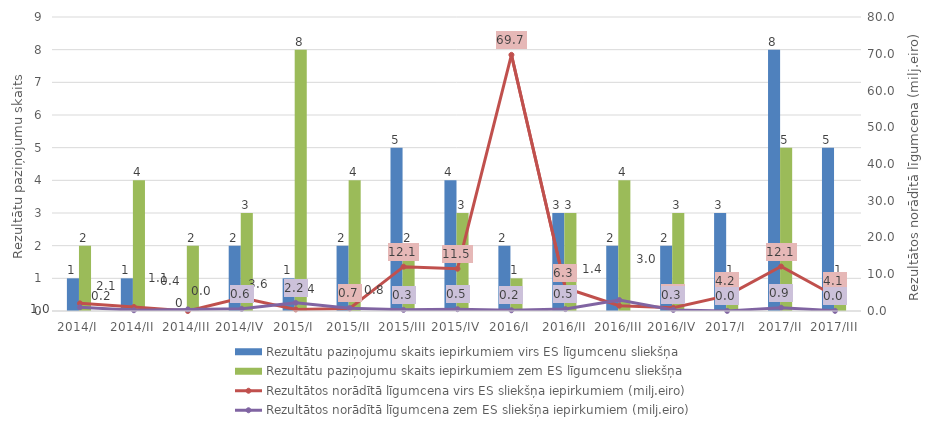
| Category | Rezultātu paziņojumu skaits iepirkumiem virs ES līgumcenu sliekšņa | Rezultātu paziņojumu skaits iepirkumiem zem ES līgumcenu sliekšņa |
|---|---|---|
| 2014/I | 1 | 2 |
| 2014/II | 1 | 4 |
| 2014/III | 0 | 2 |
| 2014/IV | 2 | 3 |
| 2015/I | 1 | 8 |
| 2015/II | 2 | 4 |
| 2015/III | 5 | 2 |
| 2015/IV | 4 | 3 |
| 2016/I | 2 | 1 |
| 2016/II | 3 | 3 |
| 2016/III | 2 | 4 |
| 2016/IV | 2 | 3 |
| 2017/I | 3 | 1 |
| 2017/II | 8 | 5 |
| 2017/III | 5 | 1 |